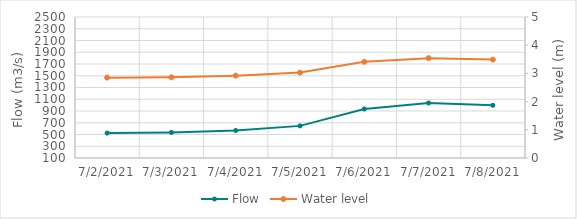
| Category | Flow |
|---|---|
| 7/7/21 | 1037.25 |
| 7/6/21 | 939.44 |
| 7/5/21 | 646.73 |
| 7/4/21 | 567.5 |
| 7/3/21 | 535.01 |
| 7/2/21 | 524.14 |
| 7/1/21 | 545.81 |